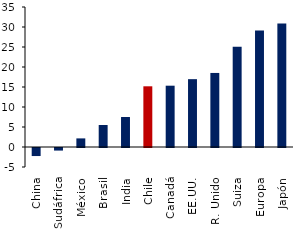
| Category | Series 0 |
|---|---|
| China | -2.011 |
| Sudáfrica | -0.643 |
| México | 2.15 |
| Brasil | 5.494 |
| India | 7.494 |
| Chile | 15.174 |
| Canadá | 15.326 |
| EE.UU. | 16.958 |
| R. Unido | 18.513 |
| Suiza | 25.035 |
| Europa | 29.146 |
| Japón | 30.891 |